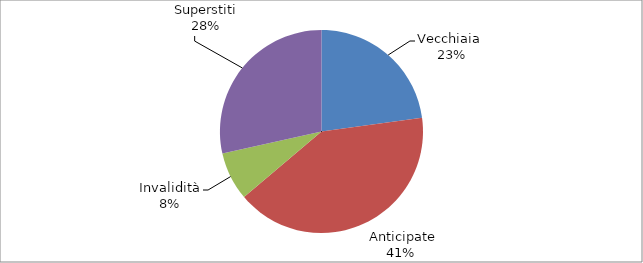
| Category | Series 0 |
|---|---|
| Vecchiaia  | 16055 |
|  Anticipate | 28839 |
| Invalidità | 5426 |
| Superstiti | 20028 |